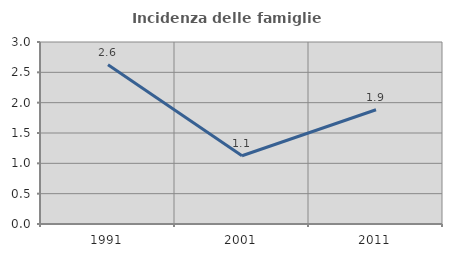
| Category | Incidenza delle famiglie numerose |
|---|---|
| 1991.0 | 2.626 |
| 2001.0 | 1.126 |
| 2011.0 | 1.883 |